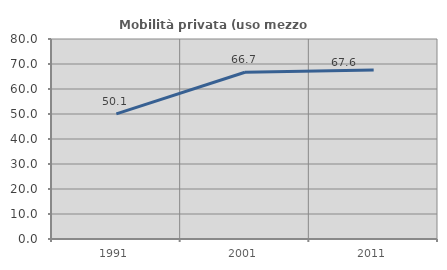
| Category | Mobilità privata (uso mezzo privato) |
|---|---|
| 1991.0 | 50.067 |
| 2001.0 | 66.681 |
| 2011.0 | 67.604 |